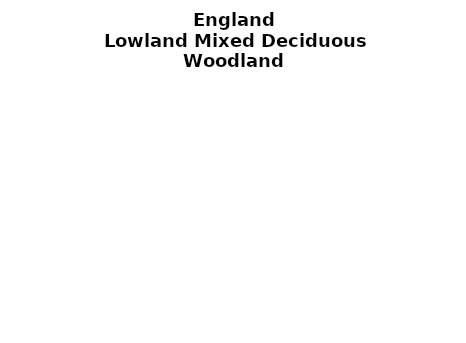
| Category | Lowland Mixed Deciduous Woodland |
|---|---|
|  ≥ 10ha, < 10%  | 0.292 |
|   ≥ 10ha, 10-25% | 0.102 |
|   ≥ 10ha, > 25 and <50%  | 0.11 |
|   ≥ 10ha, ≥ 50%  | 0.131 |
|  < 10ha, < 10% | 0.05 |
|  < 10ha, 10-25% | 0.041 |
|  < 10ha, > 25 and < 50% | 0.098 |
|  < 10ha, ≥ 50% | 0.174 |